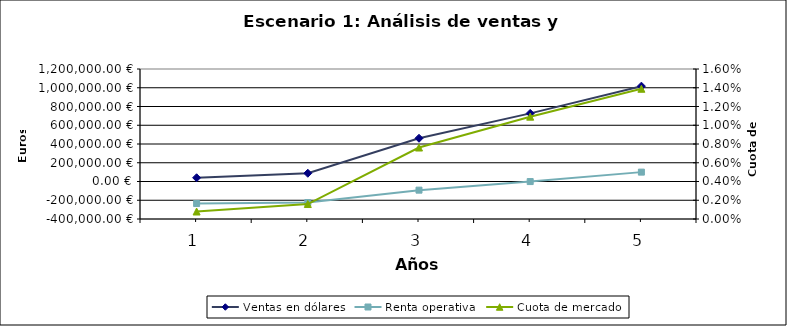
| Category | Ventas en dólares | Renta operativa |
|---|---|---|
| 0 | 40000 | -235000 |
| 1 | 87852.791 | -224555.203 |
| 2 | 461227.153 | -92264.817 |
| 3 | 726432.767 | -769.462 |
| 4 | 1017005.873 | 100000 |